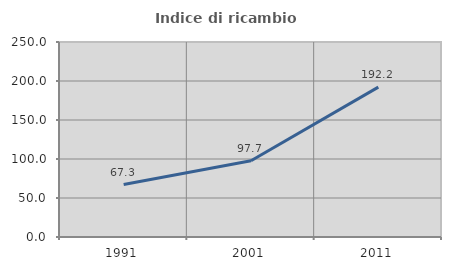
| Category | Indice di ricambio occupazionale  |
|---|---|
| 1991.0 | 67.308 |
| 2001.0 | 97.71 |
| 2011.0 | 192.174 |